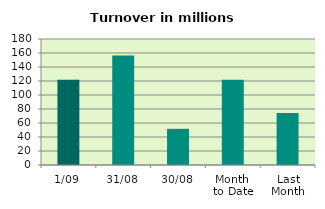
| Category | Series 0 |
|---|---|
| 1/09 | 121.849 |
| 31/08 | 156.437 |
| 30/08 | 51.667 |
| Month 
to Date | 121.849 |
| Last
Month | 74.221 |